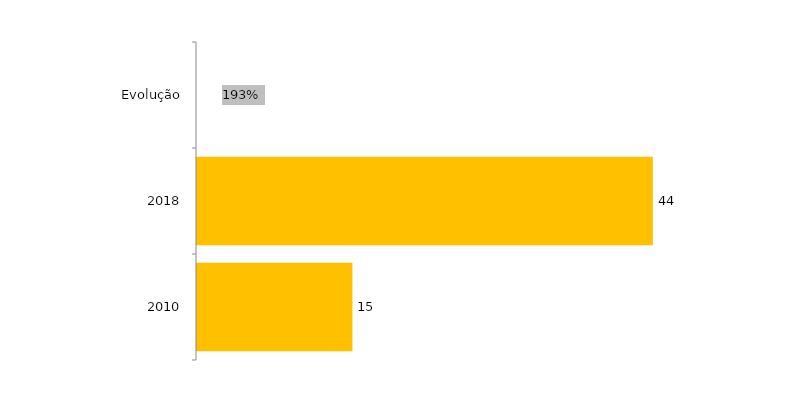
| Category | Evolução Ingressantes |
|---|---|
| 2010 | 15 |
| 2018 | 44 |
| Evolução | 1.933 |